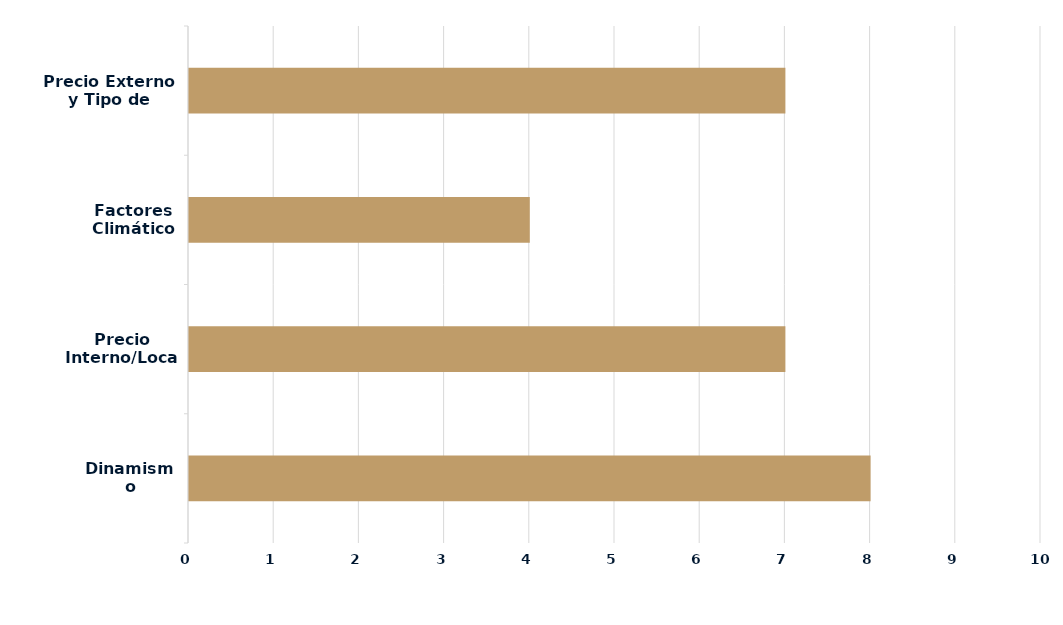
| Category | Series 0 |
|---|---|
| Dinamismo Demanda | 8 |
| Precio Interno/Local | 7 |
| Factores Climáticos | 4 |
| Precio Externo y Tipo de Cambio | 7 |